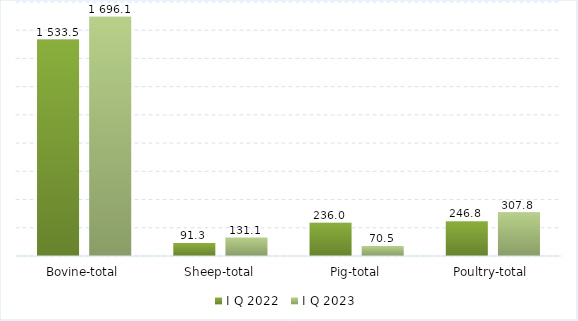
| Category | I Q 2022 | I Q 2023 |
|---|---|---|
| Bovine-total | 1533.5 | 1696.1 |
| Sheep-total | 91.3 | 131.1 |
| Pig-total | 236 | 70.5 |
| Poultry-total | 246.8 | 307.8 |